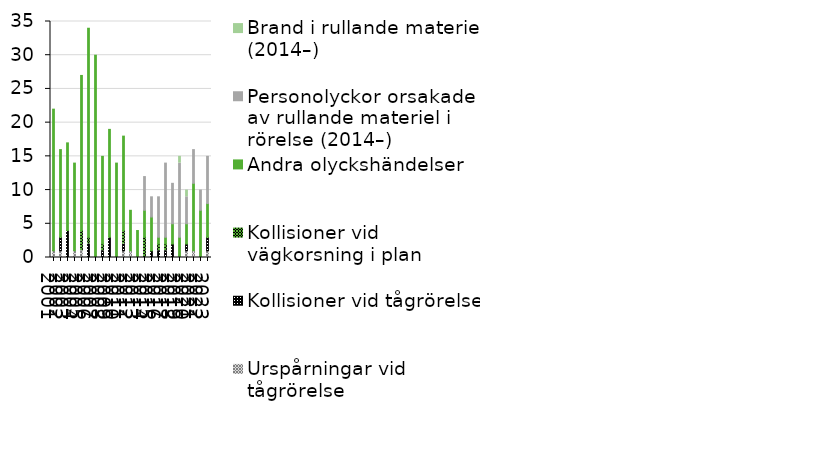
| Category | Urspårningar vid tågrörelse  | Kollisioner vid tågrörelse | Kollisioner vid vägkorsning i plan | Andra olyckshändelser | Personolyckor orsakade av rullande materiel i rörelse (2014–) | Brand i rullande materiel (2014–) |
|---|---|---|---|---|---|---|
| 2001 | 1 | 0 | 0 | 21 | 0 | 0 |
| 2002 | 1 | 2 | 0 | 13 | 0 | 0 |
| 2003 | 0 | 4 | 0 | 13 | 0 | 0 |
| 2004 | 1 | 0 | 0 | 13 | 0 | 0 |
| 2005 | 1 | 0 | 3 | 23 | 0 | 0 |
| 2006 | 0 | 2 | 1 | 31 | 0 | 0 |
| 2007 | 0 | 0 | 0 | 30 | 0 | 0 |
| 2008 | 0 | 1 | 1 | 13 | 0 | 0 |
| 2009 | 0 | 3 | 0 | 16 | 0 | 0 |
| 2010 | 0 | 0 | 0 | 14 | 0 | 0 |
| 2011 | 1 | 1 | 2 | 14 | 0 | 0 |
| 2012 | 1 | 0 | 0 | 6 | 0 | 0 |
| 2013 | 0 | 0 | 0 | 4 | 0 | 0 |
| 2014 | 0 | 0 | 3 | 4 | 5 | 0 |
| 2015 | 0 | 1 | 0 | 5 | 3 | 0 |
| 2016 | 0 | 1 | 1 | 1 | 6 | 0 |
| 2017 | 0 | 1 | 1 | 1 | 11 | 0 |
| 2018 | 0 | 2 | 0 | 3 | 6 | 0 |
| 2019 | 0 | 0 | 0 | 3 | 11 | 1 |
| 2020 | 1 | 1 | 0 | 3 | 4 | 1 |
| 2021 | 1 | 0 | 0 | 10 | 5 | 0 |
| 2022 | 0 | 0 | 0 | 7 | 3 | 0 |
| 2023 | 1 | 2 | 0 | 5 | 7 | 0 |